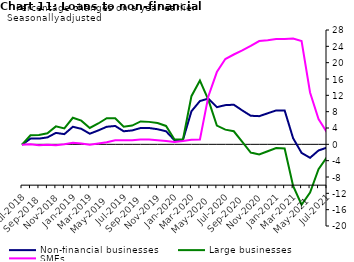
| Category | zero | Non-financial businesses | Large businesses | SMEs |
|---|---|---|---|---|
| Mar-2018 | 0 | 2.9 | 4.6 | 0.1 |
| Apr-2018 | 0 | 2 | 3.1 | 0.1 |
| May-2018 | 0 | 1 | 1.5 | 0 |
| Jun-2018 | 0 | 0.9 | 1.4 | 0 |
| Jul-2018 | 0 | -0.1 | 0 | -0.2 |
| Aug-2018 | 0 | 1.4 | 2.3 | -0.1 |
| Sep-2018 | 0 | 1.4 | 2.3 | -0.2 |
| Oct-2018 | 0 | 1.7 | 2.8 | -0.2 |
| Nov-2018 | 0 | 2.8 | 4.4 | -0.2 |
| Dec-2018 | 0 | 2.6 | 4 | 0 |
| Jan-2019 | 0 | 4.3 | 6.5 | 0.5 |
| Feb-2019 | 0 | 3.8 | 5.8 | 0.2 |
| Mar-2019 | 0 | 2.5 | 4 | 0 |
| Apr-2019 | 0 | 3.3 | 4.9 | 0.3 |
| May-2019 | 0 | 4.2 | 6.2 | 0.6 |
| Jun-2019 | 0 | 4.5 | 6.4 | 0.9 |
| Jul-2019 | 0 | 3.2 | 4.4 | 1 |
| Aug-2019 | 0 | 3.4 | 4.7 | 0.9 |
| Sep-2019 | 0 | 4.1 | 5.7 | 1.1 |
| Oct-2019 | 0 | 4 | 5.6 | 1.1 |
| Nov-2019 | 0 | 3.7 | 5.2 | 1 |
| Dec-2019 | 0 | 3.2 | 4.5 | 0.8 |
| Jan-2020 | 0 | 1 | 1.1 | 0.6 |
| Feb-2020 | 0 | 1.1 | 1.2 | 0.8 |
| Mar-2020 | 0 | 8.1 | 11.7 | 1.2 |
| Apr-2020 | 0 | 10.6 | 15.5 | 1.3 |
| May-2020 | 0 | 11.2 | 10.8 | 11.8 |
| Jun-2020 | 0 | 9.1 | 4.6 | 17.6 |
| Jul-2020 | 0 | 9.7 | 3.7 | 20.8 |
| Aug-2020 | 0 | 9.7 | 3.3 | 21.9 |
| Sep-2020 | 0 | 8.3 | 0.7 | 22.9 |
| Oct-2020 | 0 | 7 | -1.9 | 24 |
| Nov-2020 | 0 | 6.9 | -2.5 | 25.3 |
| Dec-2020 | 0 | 7.7 | -1.7 | 25.5 |
| Jan-2021 | 0 | 8.4 | -0.9 | 25.9 |
| Feb-2021 | 0 | 8.3 | -1 | 25.8 |
| Mar-2021 | 0 | 1.6 | -10.2 | 26 |